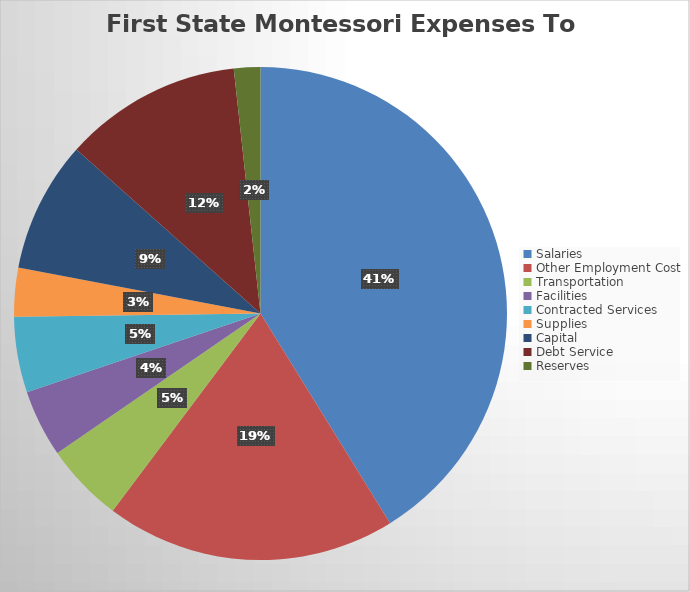
| Category | Series 0 |
|---|---|
| Salaries | 2377615.75 |
| Other Employment Cost | 1099385.1 |
| Transportation | 299443.53 |
| Facilities | 254176.8 |
| Contracted Services | 286646.83 |
| Supplies | 184382.48 |
| Capital | 496439.15 |
| Debt Service | 674600 |
| Reserves | 100000 |